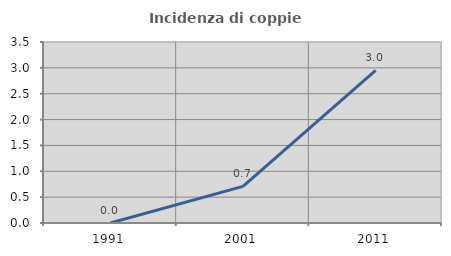
| Category | Incidenza di coppie miste |
|---|---|
| 1991.0 | 0 |
| 2001.0 | 0.708 |
| 2011.0 | 2.953 |